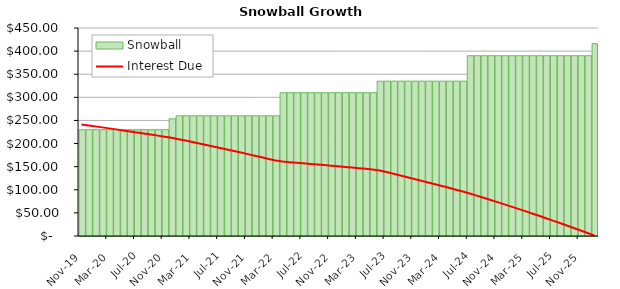
| Category | Snowball |
|---|---|
| 2019-11-01 | 230 |
| 2019-12-01 | 230 |
| 2020-01-01 | 230 |
| 2020-02-01 | 230 |
| 2020-03-01 | 230 |
| 2020-04-01 | 230 |
| 2020-05-01 | 230 |
| 2020-06-01 | 230 |
| 2020-07-01 | 230 |
| 2020-08-01 | 230 |
| 2020-09-01 | 230 |
| 2020-10-01 | 230 |
| 2020-11-01 | 230 |
| 2020-12-01 | 253.55 |
| 2021-01-01 | 260 |
| 2021-02-01 | 260 |
| 2021-03-01 | 260 |
| 2021-04-01 | 260 |
| 2021-05-01 | 260 |
| 2021-06-01 | 260 |
| 2021-07-01 | 260 |
| 2021-08-01 | 260 |
| 2021-09-01 | 260 |
| 2021-10-01 | 260 |
| 2021-11-01 | 260 |
| 2021-12-01 | 260 |
| 2022-01-01 | 260 |
| 2022-02-01 | 260 |
| 2022-03-01 | 260 |
| 2022-04-01 | 310 |
| 2022-05-01 | 310 |
| 2022-06-01 | 310 |
| 2022-07-01 | 310 |
| 2022-08-01 | 310 |
| 2022-09-01 | 310 |
| 2022-10-01 | 310 |
| 2022-11-01 | 310 |
| 2022-12-01 | 310 |
| 2023-01-01 | 310 |
| 2023-02-01 | 310 |
| 2023-03-01 | 310 |
| 2023-04-01 | 310 |
| 2023-05-01 | 310 |
| 2023-06-01 | 335 |
| 2023-07-01 | 335 |
| 2023-08-01 | 335 |
| 2023-09-01 | 335 |
| 2023-10-01 | 335 |
| 2023-11-01 | 335 |
| 2023-12-01 | 335 |
| 2024-01-01 | 335 |
| 2024-02-01 | 335 |
| 2024-03-01 | 335 |
| 2024-04-01 | 335 |
| 2024-05-01 | 335 |
| 2024-06-01 | 335 |
| 2024-07-01 | 390 |
| 2024-08-01 | 390 |
| 2024-09-01 | 390 |
| 2024-10-01 | 390 |
| 2024-11-01 | 390 |
| 2024-12-01 | 390 |
| 2025-01-01 | 390 |
| 2025-02-01 | 390 |
| 2025-03-01 | 390 |
| 2025-04-01 | 390 |
| 2025-05-01 | 390 |
| 2025-06-01 | 390 |
| 2025-07-01 | 390 |
| 2025-08-01 | 390 |
| 2025-09-01 | 390 |
| 2025-10-01 | 390 |
| 2025-11-01 | 390 |
| 2025-12-01 | 390 |
| 2026-01-01 | 416.05 |
| #N/A | 0 |
| #N/A | 0 |
| #N/A | 0 |
| #N/A | 0 |
| #N/A | 0 |
| #N/A | 0 |
| #N/A | 0 |
| #N/A | 0 |
| #N/A | 0 |
| #N/A | 0 |
| #N/A | 0 |
| #N/A | 0 |
| #N/A | 0 |
| #N/A | 0 |
| #N/A | 0 |
| #N/A | 0 |
| #N/A | 0 |
| #N/A | 0 |
| #N/A | 0 |
| #N/A | 0 |
| #N/A | 0 |
| #N/A | 0 |
| #N/A | 0 |
| #N/A | 0 |
| #N/A | 0 |
| #N/A | 0 |
| #N/A | 0 |
| #N/A | 0 |
| #N/A | 0 |
| #N/A | 0 |
| #N/A | 0 |
| #N/A | 0 |
| #N/A | 0 |
| #N/A | 0 |
| #N/A | 0 |
| #N/A | 0 |
| #N/A | 0 |
| #N/A | 0 |
| #N/A | 0 |
| #N/A | 0 |
| #N/A | 0 |
| #N/A | 0 |
| #N/A | 0 |
| #N/A | 0 |
| #N/A | 0 |
| #N/A | 0 |
| #N/A | 0 |
| #N/A | 0 |
| #N/A | 0 |
| #N/A | 0 |
| #N/A | 0 |
| #N/A | 0 |
| #N/A | 0 |
| #N/A | 0 |
| #N/A | 0 |
| #N/A | 0 |
| #N/A | 0 |
| #N/A | 0 |
| #N/A | 0 |
| #N/A | 0 |
| #N/A | 0 |
| #N/A | 0 |
| #N/A | 0 |
| #N/A | 0 |
| #N/A | 0 |
| #N/A | 0 |
| #N/A | 0 |
| #N/A | 0 |
| #N/A | 0 |
| #N/A | 0 |
| #N/A | 0 |
| #N/A | 0 |
| #N/A | 0 |
| #N/A | 0 |
| #N/A | 0 |
| #N/A | 0 |
| #N/A | 0 |
| #N/A | 0 |
| #N/A | 0 |
| #N/A | 0 |
| #N/A | 0 |
| #N/A | 0 |
| #N/A | 0 |
| #N/A | 0 |
| #N/A | 0 |
| #N/A | 0 |
| #N/A | 0 |
| #N/A | 0 |
| #N/A | 0 |
| #N/A | 0 |
| #N/A | 0 |
| #N/A | 0 |
| #N/A | 0 |
| #N/A | 0 |
| #N/A | 0 |
| #N/A | 0 |
| #N/A | 0 |
| #N/A | 0 |
| #N/A | 0 |
| #N/A | 0 |
| #N/A | 0 |
| #N/A | 0 |
| #N/A | 0 |
| #N/A | 0 |
| #N/A | 0 |
| #N/A | 0 |
| #N/A | 0 |
| #N/A | 0 |
| #N/A | 0 |
| #N/A | 0 |
| #N/A | 0 |
| #N/A | 0 |
| #N/A | 0 |
| #N/A | 0 |
| #N/A | 0 |
| #N/A | 0 |
| #N/A | 0 |
| #N/A | 0 |
| #N/A | 0 |
| #N/A | 0 |
| #N/A | 0 |
| #N/A | 0 |
| #N/A | 0 |
| #N/A | 0 |
| #N/A | 0 |
| #N/A | 0 |
| #N/A | 0 |
| #N/A | 0 |
| #N/A | 0 |
| #N/A | 0 |
| #N/A | 0 |
| #N/A | 0 |
| #N/A | 0 |
| #N/A | 0 |
| #N/A | 0 |
| #N/A | 0 |
| #N/A | 0 |
| #N/A | 0 |
| #N/A | 0 |
| #N/A | 0 |
| #N/A | 0 |
| #N/A | 0 |
| #N/A | 0 |
| #N/A | 0 |
| #N/A | 0 |
| #N/A | 0 |
| #N/A | 0 |
| #N/A | 0 |
| #N/A | 0 |
| #N/A | 0 |
| #N/A | 0 |
| #N/A | 0 |
| #N/A | 0 |
| #N/A | 0 |
| #N/A | 0 |
| #N/A | 0 |
| #N/A | 0 |
| #N/A | 0 |
| #N/A | 0 |
| #N/A | 0 |
| #N/A | 0 |
| #N/A | 0 |
| #N/A | 0 |
| #N/A | 0 |
| #N/A | 0 |
| #N/A | 0 |
| #N/A | 0 |
| #N/A | 0 |
| #N/A | 0 |
| #N/A | 0 |
| #N/A | 0 |
| #N/A | 0 |
| #N/A | 0 |
| #N/A | 0 |
| #N/A | 0 |
| #N/A | 0 |
| #N/A | 0 |
| #N/A | 0 |
| #N/A | 0 |
| #N/A | 0 |
| #N/A | 0 |
| #N/A | 0 |
| #N/A | 0 |
| #N/A | 0 |
| #N/A | 0 |
| #N/A | 0 |
| #N/A | 0 |
| #N/A | 0 |
| #N/A | 0 |
| #N/A | 0 |
| #N/A | 0 |
| #N/A | 0 |
| #N/A | 0 |
| #N/A | 0 |
| #N/A | 0 |
| #N/A | 0 |
| #N/A | 0 |
| #N/A | 0 |
| #N/A | 0 |
| #N/A | 0 |
| #N/A | 0 |
| #N/A | 0 |
| #N/A | 0 |
| #N/A | 0 |
| #N/A | 0 |
| #N/A | 0 |
| #N/A | 0 |
| #N/A | 0 |
| #N/A | 0 |
| #N/A | 0 |
| #N/A | 0 |
| #N/A | 0 |
| #N/A | 0 |
| #N/A | 0 |
| #N/A | 0 |
| #N/A | 0 |
| #N/A | 0 |
| #N/A | 0 |
| #N/A | 0 |
| #N/A | 0 |
| #N/A | 0 |
| #N/A | 0 |
| #N/A | 0 |
| #N/A | 0 |
| #N/A | 0 |
| #N/A | 0 |
| #N/A | 0 |
| #N/A | 0 |
| #N/A | 0 |
| #N/A | 0 |
| #N/A | 0 |
| #N/A | 0 |
| #N/A | 0 |
| #N/A | 0 |
| #N/A | 0 |
| #N/A | 0 |
| #N/A | 0 |
| #N/A | 0 |
| #N/A | 0 |
| #N/A | 0 |
| #N/A | 0 |
| #N/A | 0 |
| #N/A | 0 |
| #N/A | 0 |
| #N/A | 0 |
| #N/A | 0 |
| #N/A | 0 |
| #N/A | 0 |
| #N/A | 0 |
| #N/A | 0 |
| #N/A | 0 |
| #N/A | 0 |
| #N/A | 0 |
| #N/A | 0 |
| #N/A | 0 |
| #N/A | 0 |
| #N/A | 0 |
| #N/A | 0 |
| #N/A | 0 |
| #N/A | 0 |
| #N/A | 0 |
| #N/A | 0 |
| #N/A | 0 |
| #N/A | 0 |
| #N/A | 0 |
| #N/A | 0 |
| #N/A | 0 |
| #N/A | 0 |
| #N/A | 0 |
| #N/A | 0 |
| #N/A | 0 |
| #N/A | 0 |
| #N/A | 0 |
| #N/A | 0 |
| #N/A | 0 |
| #N/A | 0 |
| #N/A | 0 |
| #N/A | 0 |
| #N/A | 0 |
| #N/A | 0 |
| #N/A | 0 |
| #N/A | 0 |
| #N/A | 0 |
| #N/A | 0 |
| #N/A | 0 |